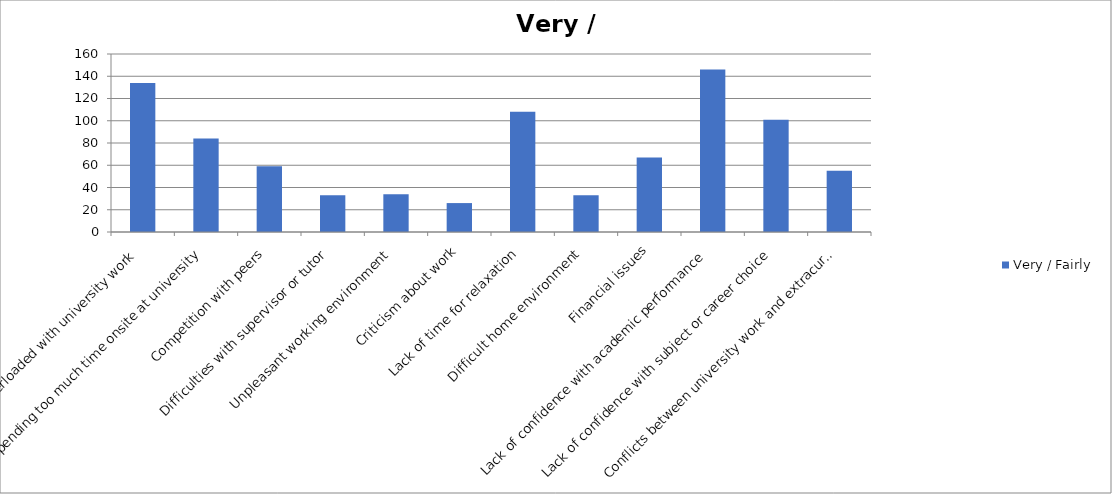
| Category | Very / Fairly |
|---|---|
| Feeling overloaded with university work | 134 |
| Spending too much time onsite at university | 84 |
| Competition with peers | 59 |
| Difficulties with supervisor or tutor | 33 |
| Unpleasant working environment | 34 |
| Criticism about work | 26 |
| Lack of time for relaxation | 108 |
| Difficult home environment | 33 |
| Financial issues | 67 |
| Lack of confidence with academic performance | 146 |
| Lack of confidence with subject or career choice | 101 |
| Conflicts between university work and extracurricular employment | 55 |